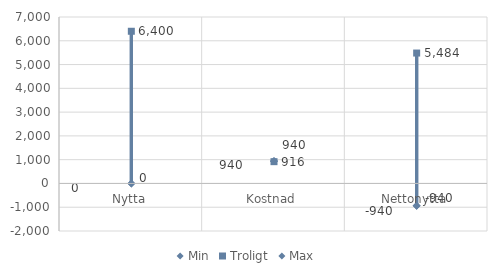
| Category | Min | Troligt | Max |
|---|---|---|---|
| Nytta | 0 | 6400 | 0 |
| Kostnad | 940 | 916 | 940 |
| Nettonytta | -940 | 5484 | -940 |